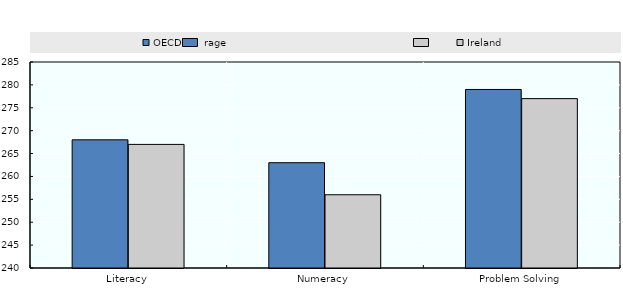
| Category | OECD Average | Ireland |
|---|---|---|
| Literacy | 268 | 267 |
| Numeracy | 263 | 256 |
| Problem Solving | 279 | 277 |